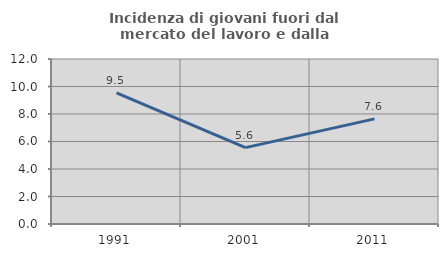
| Category | Incidenza di giovani fuori dal mercato del lavoro e dalla formazione  |
|---|---|
| 1991.0 | 9.544 |
| 2001.0 | 5.556 |
| 2011.0 | 7.647 |